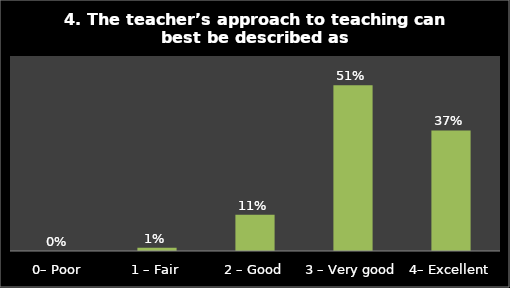
| Category | Series 0 |
|---|---|
| 0– Poor | 0 |
| 1 – Fair | 0.01 |
| 2 – Good | 0.112 |
| 3 – Very good | 0.51 |
| 4– Excellent | 0.371 |